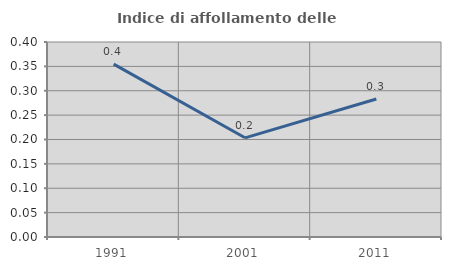
| Category | Indice di affollamento delle abitazioni  |
|---|---|
| 1991.0 | 0.355 |
| 2001.0 | 0.203 |
| 2011.0 | 0.283 |